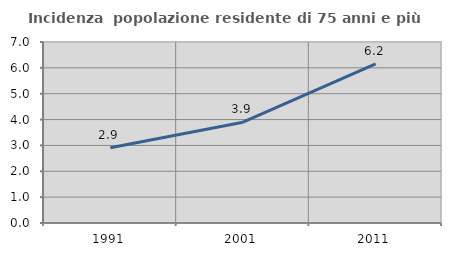
| Category | Incidenza  popolazione residente di 75 anni e più |
|---|---|
| 1991.0 | 2.907 |
| 2001.0 | 3.898 |
| 2011.0 | 6.157 |